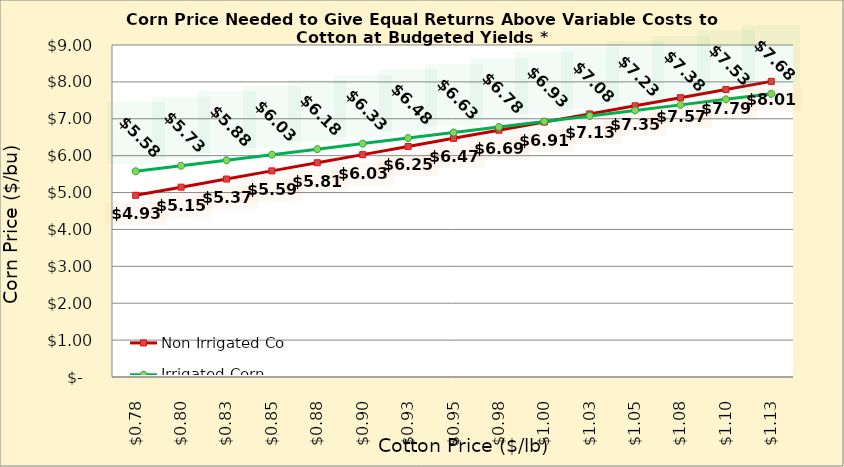
| Category | Non Irrigated Corn | Irrigated Corn |
|---|---|---|
| 0.7749999999999998 | 4.925 | 5.577 |
| 0.7999999999999998 | 5.146 | 5.727 |
| 0.8249999999999998 | 5.367 | 5.877 |
| 0.8499999999999999 | 5.587 | 6.027 |
| 0.8749999999999999 | 5.808 | 6.177 |
| 0.8999999999999999 | 6.028 | 6.327 |
| 0.9249999999999999 | 6.249 | 6.477 |
| 0.95 | 6.47 | 6.627 |
| 0.975 | 6.69 | 6.777 |
| 1.0 | 6.911 | 6.927 |
| 1.025 | 7.131 | 7.077 |
| 1.0499999999999998 | 7.352 | 7.227 |
| 1.0749999999999997 | 7.572 | 7.377 |
| 1.0999999999999996 | 7.793 | 7.527 |
| 1.1249999999999996 | 8.014 | 7.677 |